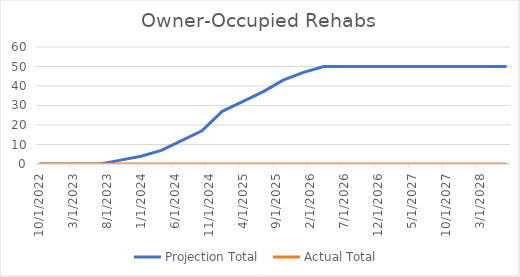
| Category | Projection Total  | Actual Total  |
|---|---|---|
| 10/1/22 | 0 | 0 |
| 1/1/23 | 0 | 0 |
| 4/1/23 | 0 | 0 |
| 7/1/23 | 0 | 0 |
| 10/1/23 | 2 | 0 |
| 1/1/24 | 4 | 0 |
| 4/1/24 | 7 | 0 |
| 7/1/24 | 12 | 0 |
| 10/1/24 | 17 | 0 |
| 1/1/25 | 27 | 0 |
| 4/1/25 | 32 | 0 |
| 7/1/25 | 37 | 0 |
| 10/1/25 | 43 | 0 |
| 1/1/26 | 47 | 0 |
| 4/1/26 | 50 | 0 |
| 7/1/26 | 50 | 0 |
| 10/1/26 | 50 | 0 |
| 1/1/27 | 50 | 0 |
| 4/1/27 | 50 | 0 |
| 7/1/27 | 50 | 0 |
| 10/1/27 | 50 | 0 |
| 1/1/28 | 50 | 0 |
| 4/1/28 | 50 | 0 |
| 7/1/28 | 50 | 0 |